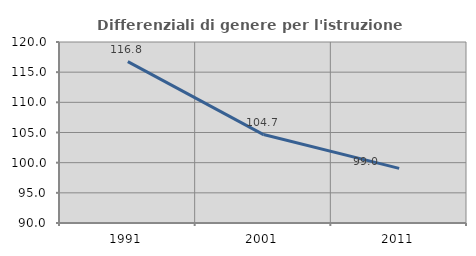
| Category | Differenziali di genere per l'istruzione superiore |
|---|---|
| 1991.0 | 116.753 |
| 2001.0 | 104.659 |
| 2011.0 | 99.05 |